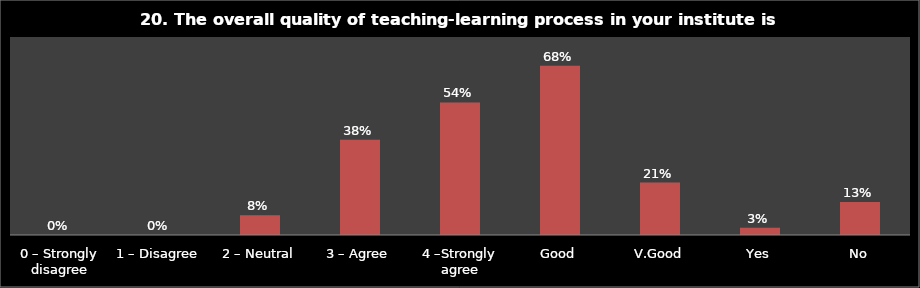
| Category | Series 0 |
|---|---|
| 0 – Strongly disagree | 0 |
| 1 – Disagree | 0 |
| 2 – Neutral | 0.08 |
| 3 – Agree | 0.385 |
| 4 –Strongly agree | 0.536 |
| Good | 0.684 |
| V.Good | 0.212 |
| Yes | 0.029 |
| No | 0.133 |